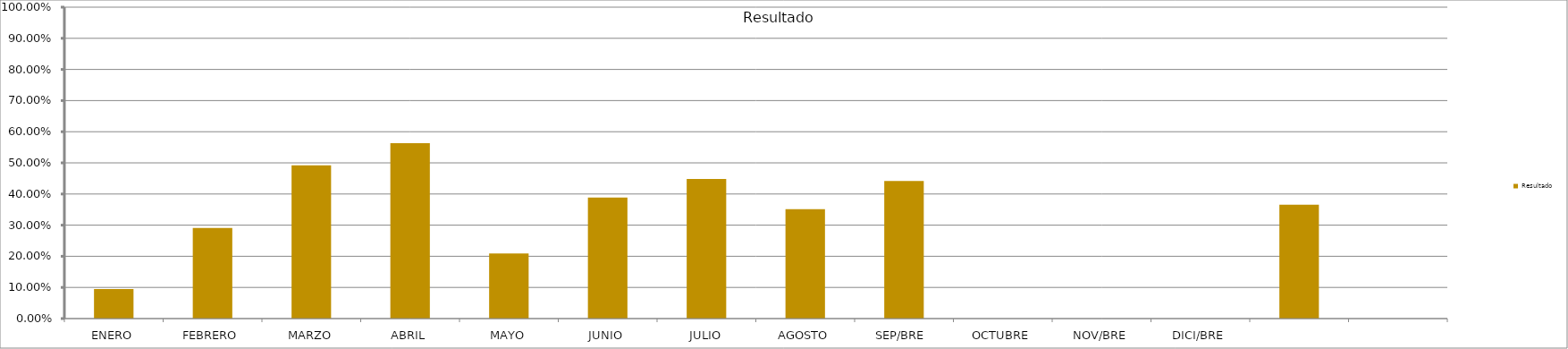
| Category | Resultado  |
|---|---|
| ENERO | 0.095 |
| FEBRERO | 0.291 |
| MARZO | 0.492 |
| ABRIL | 0.564 |
| MAYO | 0.209 |
| JUNIO | 0.389 |
| JULIO | 0.448 |
| AGOSTO | 0.351 |
| SEP/BRE  | 0.442 |
| OCTUBRE | 0 |
| NOV/BRE | 0 |
| DICI/BRE | 0 |